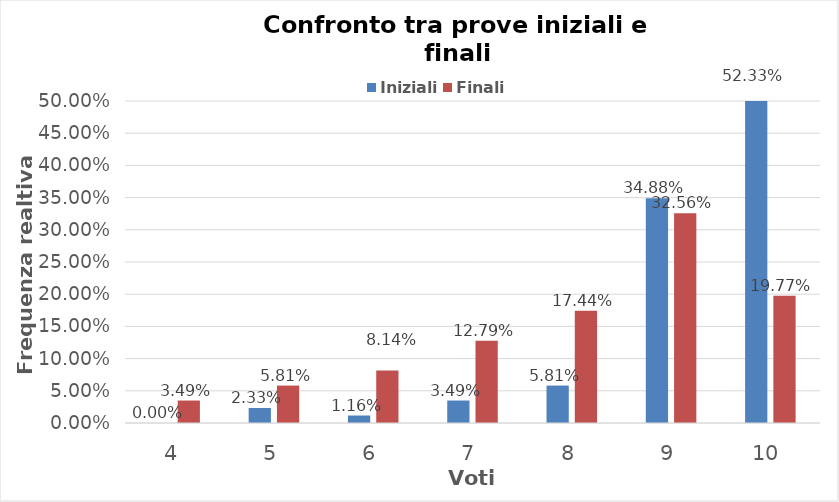
| Category | Iniziali | Finali |
|---|---|---|
| 4.0 | 0 | 0.035 |
| 5.0 | 0.023 | 0.058 |
| 6.0 | 0.012 | 0.081 |
| 7.0 | 0.035 | 0.128 |
| 8.0 | 0.058 | 0.174 |
| 9.0 | 0.349 | 0.326 |
| 10.0 | 0.523 | 0.198 |